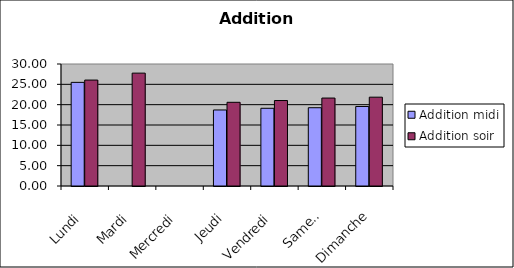
| Category | Addition |
|---|---|
| Lundi | 26.05 |
| Mardi | 27.752 |
| Mercredi | 0 |
| Jeudi | 20.58 |
| Vendredi | 21.018 |
| Samedi | 21.625 |
| Dimanche | 21.842 |